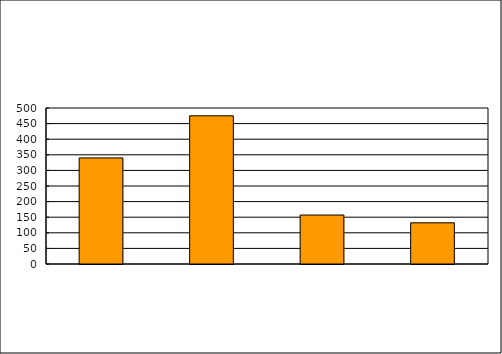
| Category | Series 0 |
|---|---|
| 0 | 340 |
| 1 | 475 |
| 2 | 157 |
| 3 | 132 |